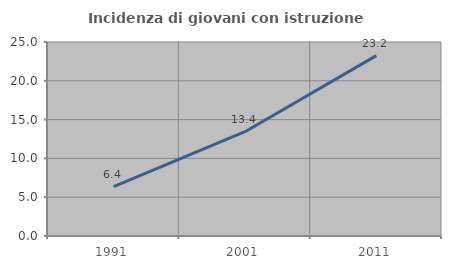
| Category | Incidenza di giovani con istruzione universitaria |
|---|---|
| 1991.0 | 6.377 |
| 2001.0 | 13.437 |
| 2011.0 | 23.248 |